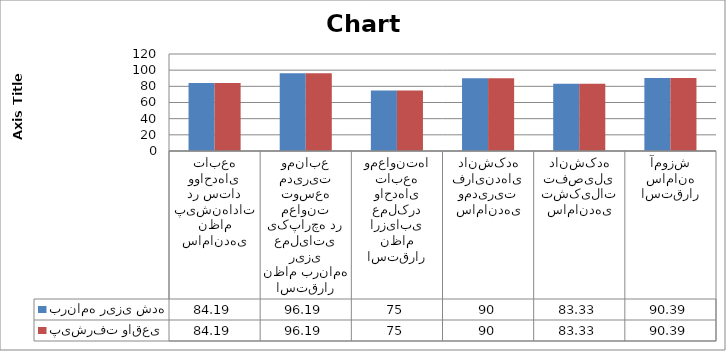
| Category | برنامه ریزی شده | پیشرفت واقعی |
|---|---|---|
| ساماندهی نظام پیشنهادات در ستاد وواحدهای تابعه | 84.19 | 84.19 |
| استقرار نظام برنامه ریزی عملیاتی یکپارچه در معاونت توسعه مدیریت ومنابع | 96.19 | 96.19 |
| استقرار نظام ارزیابی عملکرد واحدهای تابعه ومعاونتها | 75 | 75 |
| ساماندهی ومدیریت فرایندهای دانشکده | 90 | 90 |
| ساماندهی تشکیلات تفصیلی دانشکده | 83.33 | 83.33 |
| استقرار سامانه آموزش | 90.39 | 90.39 |